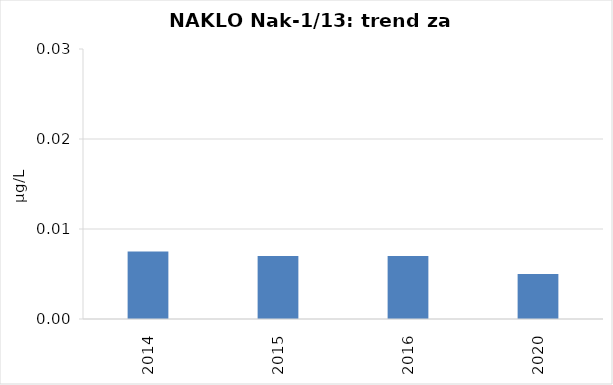
| Category | Vsota |
|---|---|
| 2014 | 0.008 |
| 2015 | 0.007 |
| 2016 | 0.007 |
| 2020 | 0.005 |